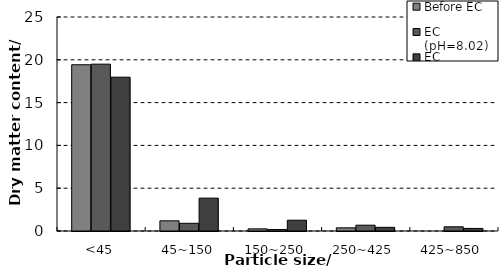
| Category | Before EC | EC (pH=8.02) | EC (pH=6.01) |
|---|---|---|---|
| <45 | 19.42 | 19.49 | 17.97 |
| 45~150 | 1.19 | 0.9 | 3.84 |
| 150~250 | 0.25 | 0.17 | 1.26 |
| 250~425 | 0.37 | 0.68 | 0.43 |
| 425~850 | 0 | 0.49 | 0.3 |